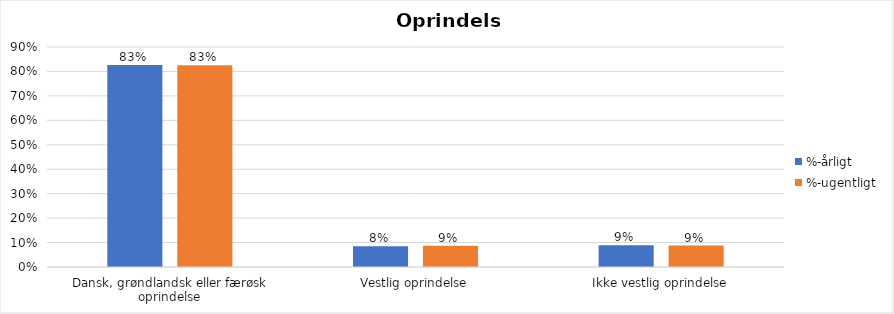
| Category | %-årligt | %-ugentligt |
|---|---|---|
| Dansk, grøndlandsk eller færøsk oprindelse | 0.826 | 0.826 |
| Vestlig oprindelse | 0.085 | 0.086 |
| Ikke vestlig oprindelse | 0.089 | 0.088 |